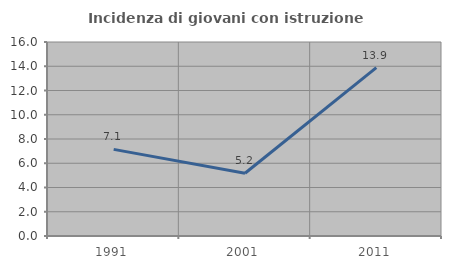
| Category | Incidenza di giovani con istruzione universitaria |
|---|---|
| 1991.0 | 7.143 |
| 2001.0 | 5.172 |
| 2011.0 | 13.889 |